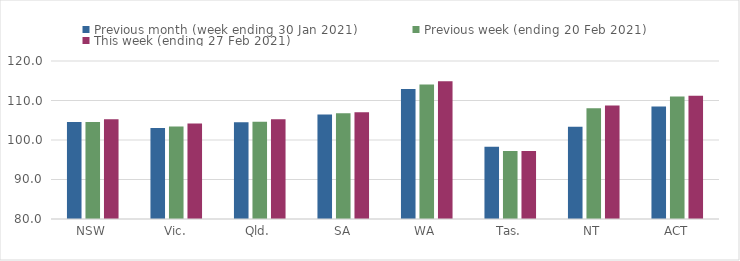
| Category | Previous month (week ending 30 Jan 2021) | Previous week (ending 20 Feb 2021) | This week (ending 27 Feb 2021) |
|---|---|---|---|
| NSW | 104.54 | 104.53 | 105.27 |
| Vic. | 103.06 | 103.43 | 104.15 |
| Qld. | 104.47 | 104.61 | 105.23 |
| SA | 106.46 | 106.79 | 107 |
| WA | 112.92 | 114.04 | 114.89 |
| Tas. | 98.29 | 97.2 | 97.2 |
| NT | 103.37 | 108.05 | 108.75 |
| ACT | 108.47 | 111.02 | 111.21 |